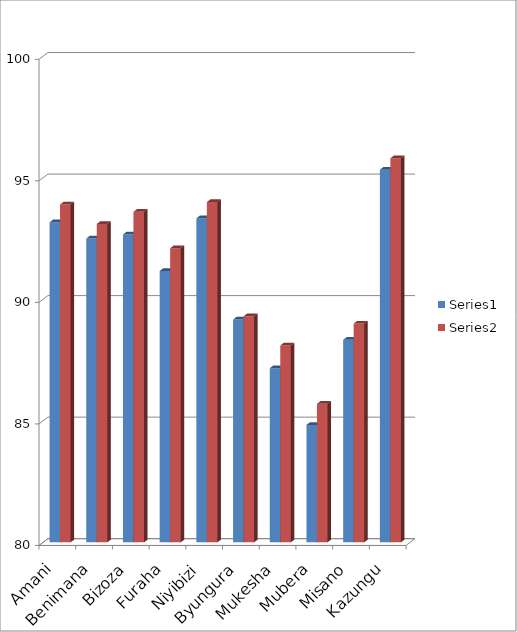
| Category | Series 0 | Series 1 |
|---|---|---|
| Amani | 93.167 | 93.9 |
| Benimana | 92.5 | 93.1 |
| Bizoza | 92.667 | 93.6 |
| Furaha | 91.167 | 92.1 |
| Niyibizi | 93.333 | 94 |
| Byungura | 89.167 | 89.3 |
| Mukesha | 87.167 | 88.1 |
| Mubera | 84.833 | 85.7 |
| Misano | 88.333 | 89 |
| Kazungu | 95.333 | 95.8 |